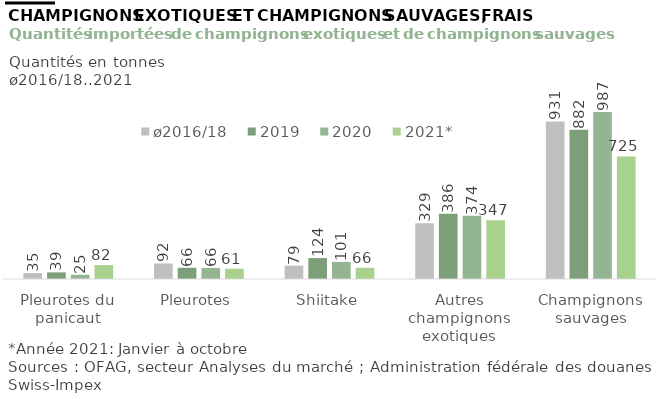
| Category | ø2016/18 | 2019 | 2020 | 2021* |
|---|---|---|---|---|
| Pleurotes du panicaut | 34.888 | 39.131 | 24.71 | 82.24 |
| Pleurotes | 91.698 | 66.388 | 65.534 | 60.713 |
| Shiitake | 78.946 | 123.637 | 101.028 | 66.157 |
| Autres champignons exotiques | 329.026 | 385.705 | 373.844 | 347.417 |
| Champignons sauvages | 931.092 | 881.945 | 987.455 | 724.644 |